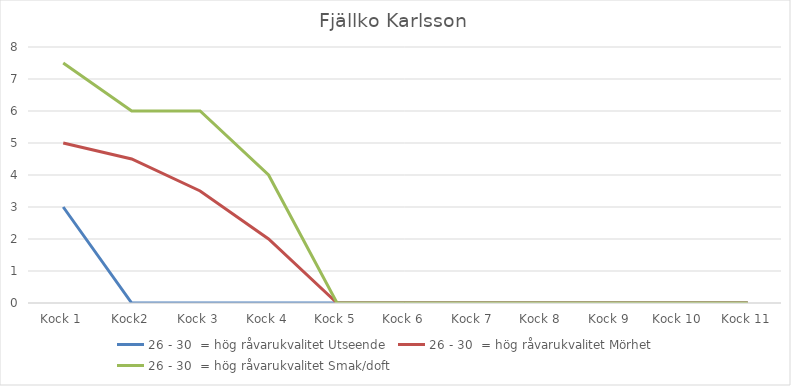
| Category | 26 - 30  = hög råvarukvalitet Utseende | 26 - 30  = hög råvarukvalitet Mörhet | 26 - 30  = hög råvarukvalitet Smak/doft |
|---|---|---|---|
| Kock 1 | 3 | 5 | 7.5 |
| Kock2 | 0 | 4.5 | 6 |
| Kock 3 | 0 | 3.5 | 6 |
| Kock 4 | 0 | 2 | 4 |
| Kock 5 | 0 | 0 | 0 |
| Kock 6 | 0 | 0 | 0 |
| Kock 7 | 0 | 0 | 0 |
| Kock 8 | 0 | 0 | 0 |
| Kock 9 | 0 | 0 | 0 |
| Kock 10 | 0 | 0 | 0 |
| Kock 11 | 0 | 0 | 0 |